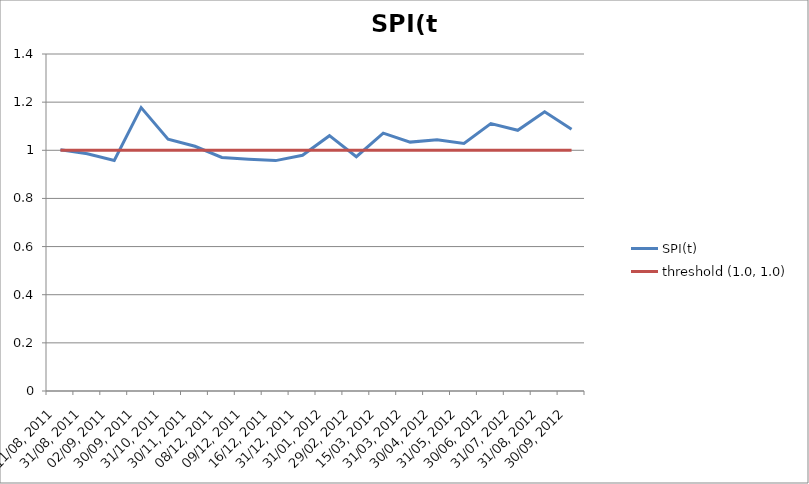
| Category | SPI(t) | threshold (1.0, 1.0) |
|---|---|---|
| 11/08, 2011 | 1.002 | 1 |
| 31/08, 2011 | 0.986 | 1 |
| 02/09, 2011 | 0.958 | 1 |
| 30/09, 2011 | 1.177 | 1 |
| 31/10, 2011 | 1.046 | 1 |
| 30/11, 2011 | 1.017 | 1 |
| 08/12, 2011 | 0.97 | 1 |
| 09/12, 2011 | 0.963 | 1 |
| 16/12, 2011 | 0.957 | 1 |
| 31/12, 2011 | 0.979 | 1 |
| 31/01, 2012 | 1.061 | 1 |
| 29/02, 2012 | 0.973 | 1 |
| 15/03, 2012 | 1.071 | 1 |
| 31/03, 2012 | 1.034 | 1 |
| 30/04, 2012 | 1.044 | 1 |
| 31/05, 2012 | 1.028 | 1 |
| 30/06, 2012 | 1.111 | 1 |
| 31/07, 2012 | 1.083 | 1 |
| 31/08, 2012 | 1.16 | 1 |
| 30/09, 2012 | 1.088 | 1 |